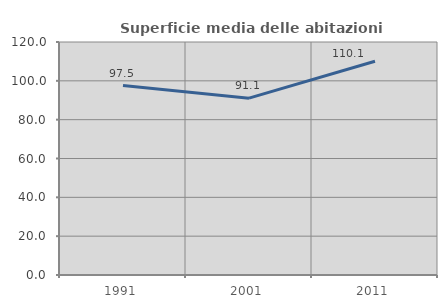
| Category | Superficie media delle abitazioni occupate |
|---|---|
| 1991.0 | 97.541 |
| 2001.0 | 91.069 |
| 2011.0 | 110.073 |